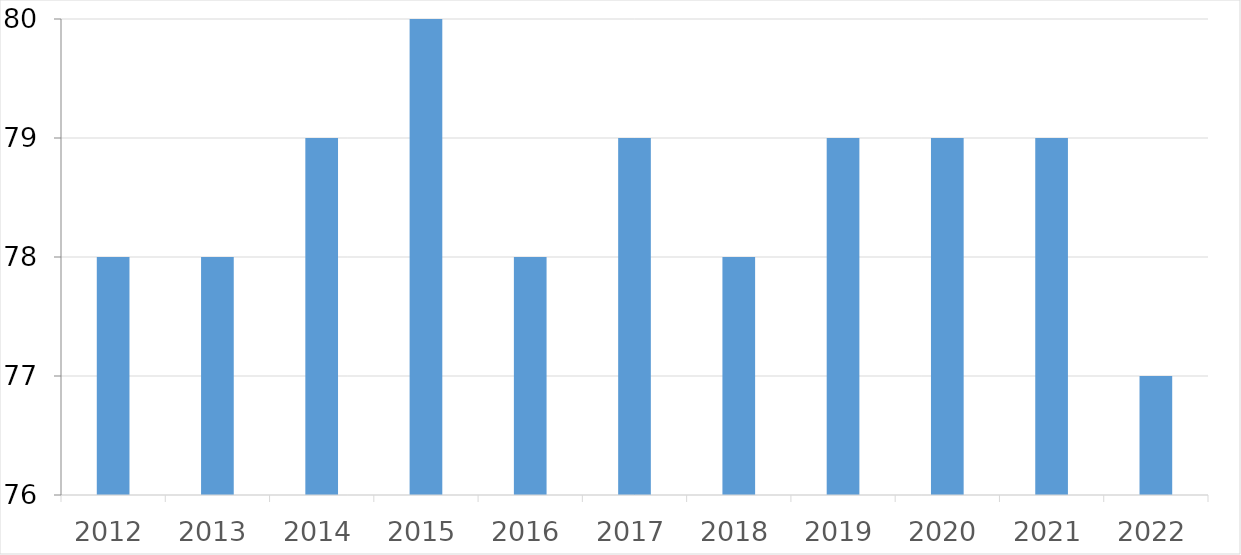
| Category | Series 0 |
|---|---|
| 2012 | 78 |
| 2013 | 78 |
| 2014 | 79 |
| 2015 | 80 |
| 2016 | 78 |
| 2017 | 79 |
| 2018 | 78 |
| 2019 | 79 |
| 2020 | 79 |
| 2021 | 79 |
| 2022 | 77 |